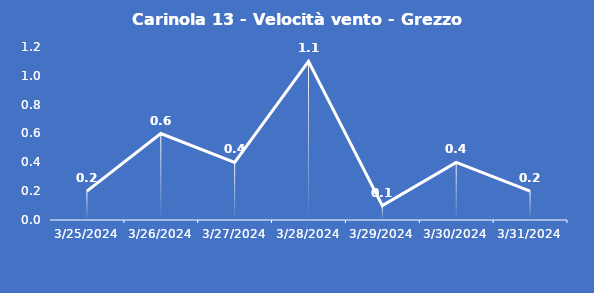
| Category | Carinola 13 - Velocità vento - Grezzo (m/s) |
|---|---|
| 3/25/24 | 0.2 |
| 3/26/24 | 0.6 |
| 3/27/24 | 0.4 |
| 3/28/24 | 1.1 |
| 3/29/24 | 0.1 |
| 3/30/24 | 0.4 |
| 3/31/24 | 0.2 |